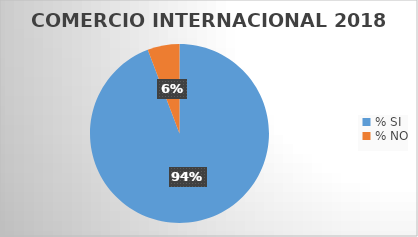
| Category | Series 0 |
|---|---|
| % SI | 94.231 |
| % NO | 5.769 |